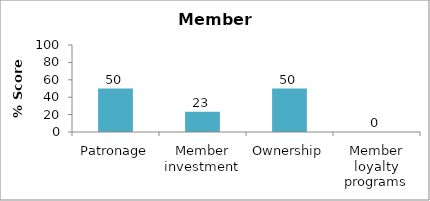
| Category | Series 0 |
|---|---|
| Patronage | 50 |
| Member investment | 23.333 |
| Ownership | 50 |
| Member loyalty programs | 0 |